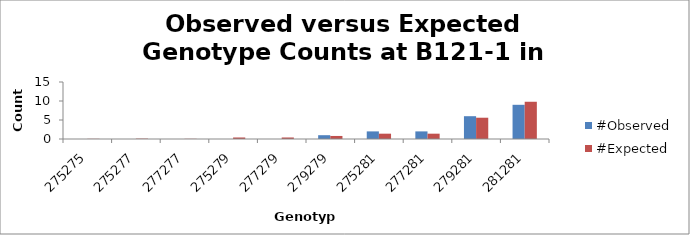
| Category | #Observed | #Expected |
|---|---|---|
| 275275.0 | 0 | 0.05 |
| 275277.0 | 0 | 0.1 |
| 277277.0 | 0 | 0.05 |
| 275279.0 | 0 | 0.4 |
| 277279.0 | 0 | 0.4 |
| 279279.0 | 1 | 0.8 |
| 275281.0 | 2 | 1.4 |
| 277281.0 | 2 | 1.4 |
| 279281.0 | 6 | 5.6 |
| 281281.0 | 9 | 9.8 |